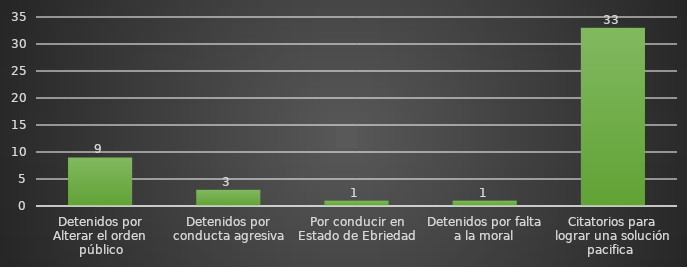
| Category | INDICADOR  |
|---|---|
| Detenidos por Alterar el orden público | 9 |
| Detenidos por conducta agresiva | 3 |
| Por conducir en Estado de Ebriedad | 1 |
| Detenidos por falta a la moral | 1 |
| Citatorios para lograr una solución pacifica  | 33 |